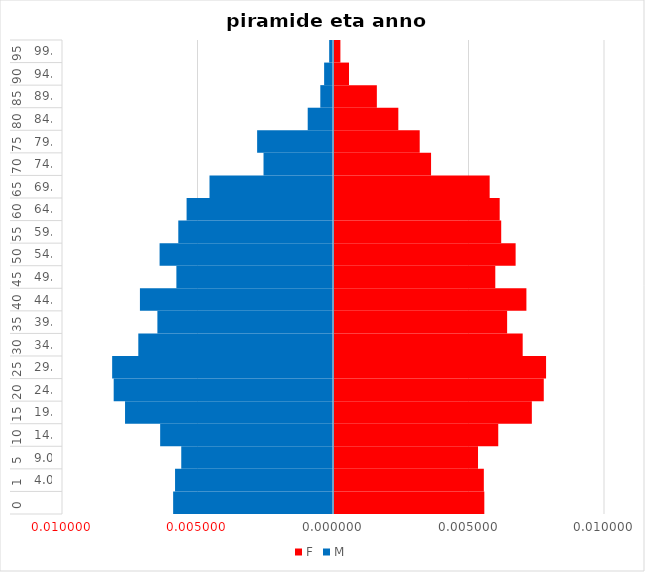
| Category | F | M |
|---|---|---|
| 0 | 0.006 | -0.006 |
| 1 | 0.006 | -0.006 |
| 2 | 0.005 | -0.006 |
| 3 | 0.006 | -0.006 |
| 4 | 0.007 | -0.008 |
| 5 | 0.008 | -0.008 |
| 6 | 0.008 | -0.008 |
| 7 | 0.007 | -0.007 |
| 8 | 0.006 | -0.006 |
| 9 | 0.007 | -0.007 |
| 10 | 0.006 | -0.006 |
| 11 | 0.007 | -0.006 |
| 12 | 0.006 | -0.006 |
| 13 | 0.006 | -0.005 |
| 14 | 0.006 | -0.005 |
| 15 | 0.004 | -0.003 |
| 16 | 0.003 | -0.003 |
| 17 | 0.002 | -0.001 |
| 18 | 0.002 | 0 |
| 19 | 0.001 | 0 |
| 20 | 0 | 0 |